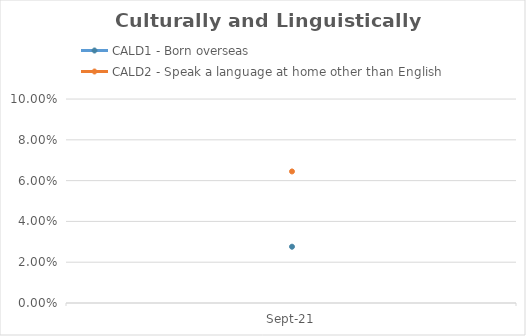
| Category | CALD1 - Born overseas | CALD2 - Speak a language at home other than English |
|---|---|---|
| 2021-09-01 | 0.028 | 0.064 |